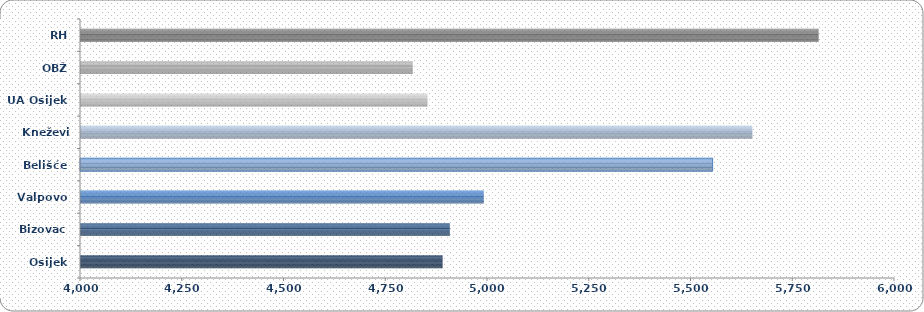
| Category | Prosječna mjesečna neto plaća |
|---|---|
| Osijek | 4890.838 |
| Bizovac | 4908.746 |
| Valpovo | 4992.057 |
| Belišće | 5554.357 |
| Kneževi Vinogradi | 5651.952 |
| UA Osijek | 4853.738 |
| OBŽ | 4817.499 |
| RH | 5814.763 |